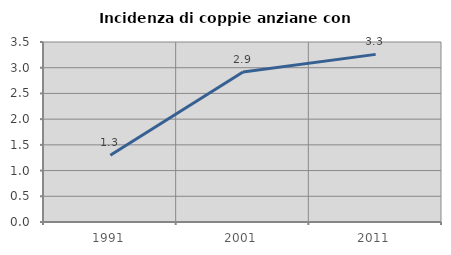
| Category | Incidenza di coppie anziane con figli |
|---|---|
| 1991.0 | 1.296 |
| 2001.0 | 2.918 |
| 2011.0 | 3.259 |